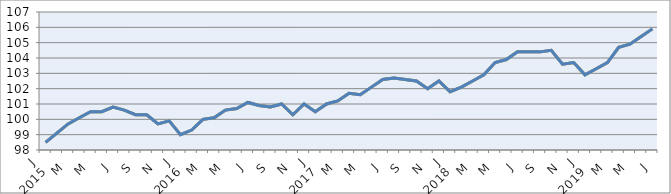
| Category | Series 1 | Series 2 | Series 0 |
|---|---|---|---|
| 0 | 98.5 | 98.5 | 98.5 |
| 1900-01-01 | 99.1 | 99.1 | 99.1 |
| 1900-01-02 | 99.7 | 99.7 | 99.7 |
| 1900-01-03 | 100.1 | 100.1 | 100.1 |
| 1900-01-04 | 100.5 | 100.5 | 100.5 |
| 1900-01-05 | 100.5 | 100.5 | 100.5 |
| 1900-01-06 | 100.8 | 100.8 | 100.8 |
| 1900-01-07 | 100.6 | 100.6 | 100.6 |
| 1900-01-08 | 100.3 | 100.3 | 100.3 |
| 1900-01-09 | 100.3 | 100.3 | 100.3 |
| 1900-01-10 | 99.7 | 99.7 | 99.7 |
| 1900-01-11 | 99.9 | 99.9 | 99.9 |
| 1900-01-12 | 99 | 99 | 99 |
| 1900-01-13 | 99.3 | 99.3 | 99.3 |
| 1900-01-14 | 100 | 100 | 100 |
| 1900-01-15 | 100.1 | 100.1 | 100.1 |
| 1900-01-16 | 100.6 | 100.6 | 100.6 |
| 1900-01-17 | 100.7 | 100.7 | 100.7 |
| 1900-01-18 | 101.1 | 101.1 | 101.1 |
| 1900-01-19 | 100.9 | 100.9 | 100.9 |
| 1900-01-20 | 100.8 | 100.8 | 100.8 |
| 1900-01-21 | 101 | 101 | 101 |
| 1900-01-22 | 100.3 | 100.3 | 100.3 |
| 1900-01-23 | 101 | 101 | 101 |
| 1900-01-24 | 100.5 | 100.5 | 100.5 |
| 1900-01-25 | 101 | 101 | 101 |
| 1900-01-26 | 101.2 | 101.2 | 101.2 |
| 1900-01-27 | 101.7 | 101.7 | 101.7 |
| 1900-01-28 | 101.6 | 101.6 | 101.6 |
| 1900-01-29 | 102.1 | 102.1 | 102.1 |
| 1900-01-30 | 102.6 | 102.6 | 102.6 |
| 1900-01-31 | 102.7 | 102.7 | 102.7 |
| 1900-02-01 | 102.6 | 102.6 | 102.6 |
| 1900-02-02 | 102.5 | 102.5 | 102.5 |
| 1900-02-03 | 102 | 102 | 102 |
| 1900-02-04 | 102.5 | 102.5 | 102.5 |
| 1900-02-05 | 101.8 | 101.8 | 101.8 |
| 1900-02-06 | 102.1 | 102.1 | 102.1 |
| 1900-02-07 | 102.5 | 102.5 | 102.5 |
| 1900-02-08 | 102.9 | 102.9 | 102.9 |
| 1900-02-09 | 103.7 | 103.7 | 103.7 |
| 1900-02-10 | 103.9 | 103.9 | 103.9 |
| 1900-02-11 | 104.4 | 104.4 | 104.4 |
| 1900-02-12 | 104.4 | 104.4 | 104.4 |
| 1900-02-13 | 104.4 | 104.4 | 104.4 |
| 1900-02-14 | 104.5 | 104.5 | 104.5 |
| 1900-02-15 | 103.6 | 103.6 | 103.6 |
| 1900-02-16 | 103.7 | 103.7 | 103.7 |
| 1900-02-17 | 102.9 | 102.9 | 102.9 |
| 1900-02-18 | 103.3 | 103.3 | 103.3 |
| 1900-02-19 | 103.7 | 103.7 | 103.7 |
| 1900-02-20 | 104.7 | 104.7 | 104.7 |
| 1900-02-21 | 104.9 | 104.9 | 104.9 |
| 1900-02-22 | 105.4 | 105.4 | 105.4 |
| 1900-02-23 | 105.9 | 105.9 | 105.9 |